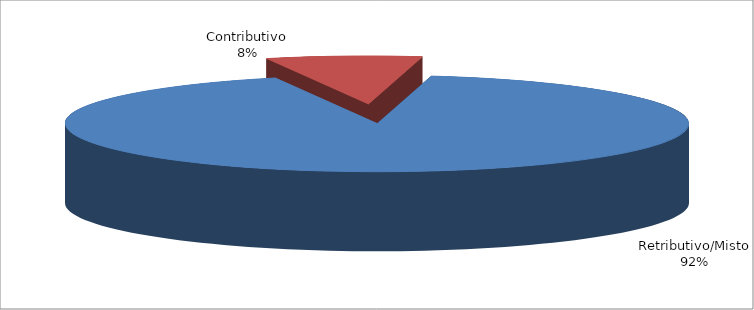
| Category | Series 1 |
|---|---|
| Retributivo/Misto | 340926 |
| Contributivo | 29911 |